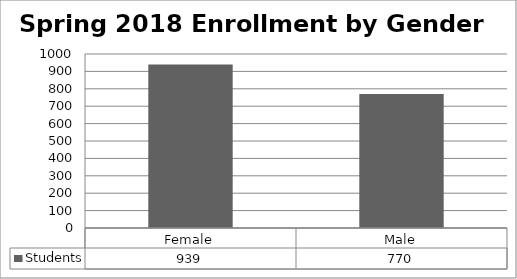
| Category | Students |
|---|---|
| Female | 939 |
| Male | 770 |